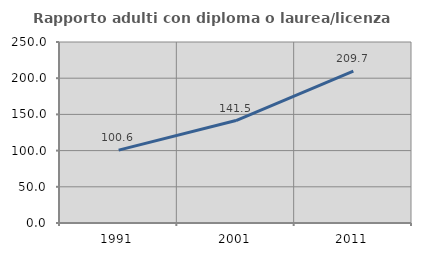
| Category | Rapporto adulti con diploma o laurea/licenza media  |
|---|---|
| 1991.0 | 100.613 |
| 2001.0 | 141.528 |
| 2011.0 | 209.673 |